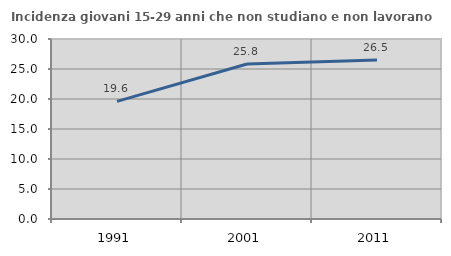
| Category | Incidenza giovani 15-29 anni che non studiano e non lavorano  |
|---|---|
| 1991.0 | 19.608 |
| 2001.0 | 25.843 |
| 2011.0 | 26.506 |